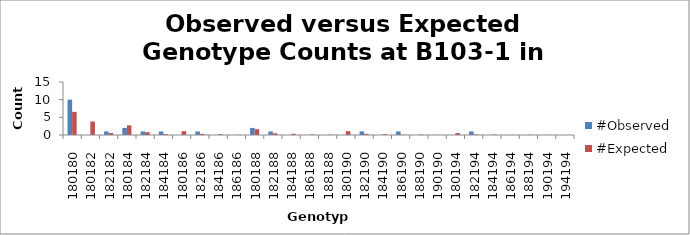
| Category | #Observed | #Expected |
|---|---|---|
| 180180.0 | 10 | 6.545 |
| 180182.0 | 0 | 3.818 |
| 182182.0 | 1 | 0.557 |
| 180184.0 | 2 | 2.727 |
| 182184.0 | 1 | 0.795 |
| 184184.0 | 1 | 0.284 |
| 180186.0 | 0 | 1.091 |
| 182186.0 | 1 | 0.318 |
| 184186.0 | 0 | 0.227 |
| 186186.0 | 0 | 0.045 |
| 180188.0 | 2 | 1.636 |
| 182188.0 | 1 | 0.477 |
| 184188.0 | 0 | 0.341 |
| 186188.0 | 0 | 0.136 |
| 188188.0 | 0 | 0.102 |
| 180190.0 | 0 | 1.091 |
| 182190.0 | 1 | 0.318 |
| 184190.0 | 0 | 0.227 |
| 186190.0 | 1 | 0.091 |
| 188190.0 | 0 | 0.136 |
| 190190.0 | 0 | 0.045 |
| 180194.0 | 0 | 0.545 |
| 182194.0 | 1 | 0.159 |
| 184194.0 | 0 | 0.114 |
| 186194.0 | 0 | 0.045 |
| 188194.0 | 0 | 0.068 |
| 190194.0 | 0 | 0.045 |
| 194194.0 | 0 | 0.011 |